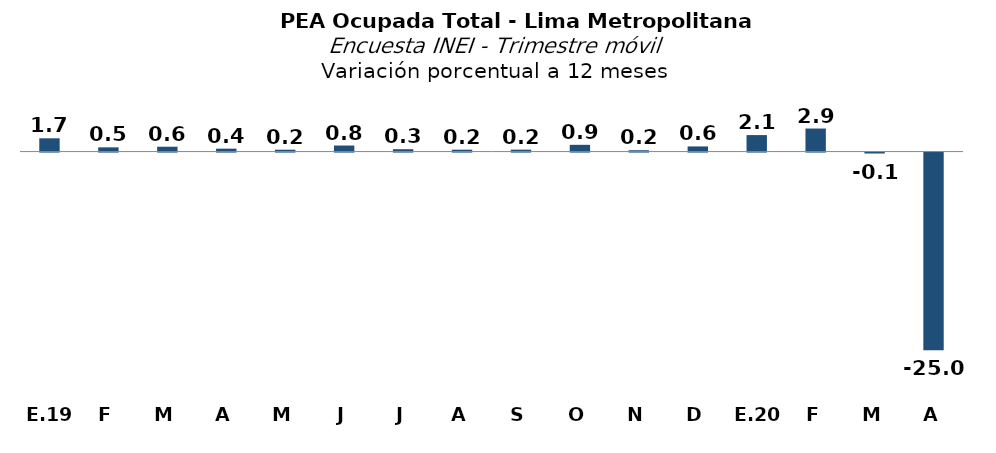
| Category | INEI |
|---|---|
| E.19 | 1.677 |
| F | 0.534 |
| M | 0.612 |
| A | 0.369 |
| M | 0.235 |
| J | 0.763 |
| J | 0.298 |
| A | 0.238 |
| S | 0.24 |
| O | 0.853 |
| N | 0.17 |
| D | 0.648 |
| E.20 | 2.083 |
| F | 2.912 |
| M | -0.118 |
| A | -24.974 |